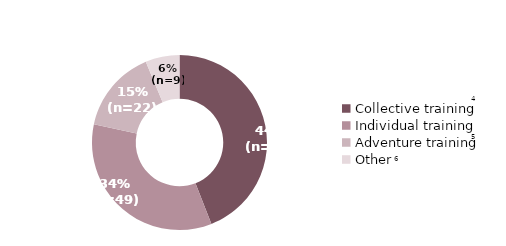
| Category | Series 0 |
|---|---|
| Collective training | 63 |
| Individual training | 49 |
| Adventure training | 22 |
| Other | 9 |